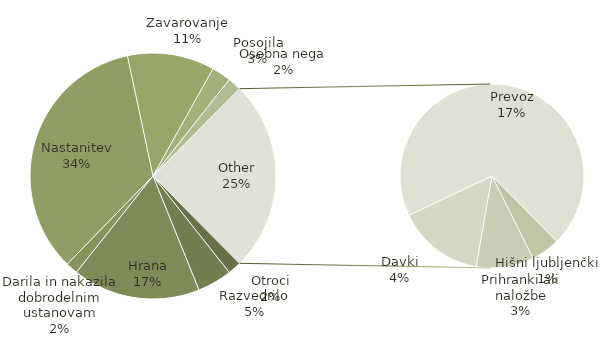
| Category | Vsota |
|---|---|
| Otroci | 140 |
| Razvedrilo | 358 |
| Hrana | 1320 |
| Darila in nakazila dobrodelnim ustanovam | 125 |
| Nastanitev | 2702 |
| Zavarovanje | 900 |
| Posojila | 200 |
| Osebna nega | 140 |
| Hišni ljubljenčki | 100 |
| Prihranki ali naložbe | 200 |
| Davki | 300 |
| Prevoz | 1375 |